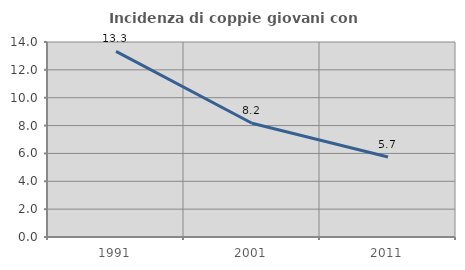
| Category | Incidenza di coppie giovani con figli |
|---|---|
| 1991.0 | 13.323 |
| 2001.0 | 8.166 |
| 2011.0 | 5.747 |